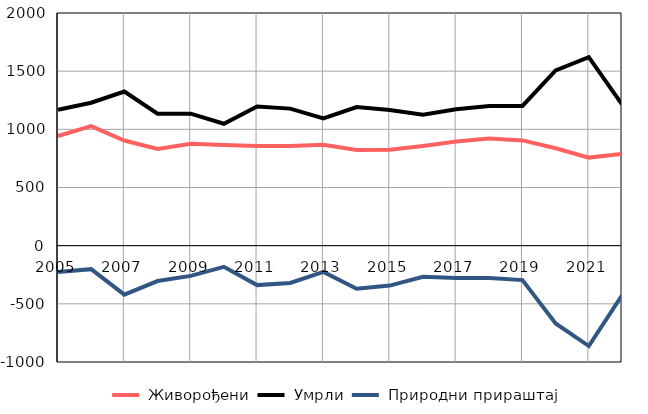
| Category |  Живорођени |  Умрли |  Природни прираштај |
|---|---|---|---|
| 2005.0 | 943 | 1169 | -226 |
| 2006.0 | 1027 | 1229 | -202 |
| 2007.0 | 904 | 1325 | -421 |
| 2008.0 | 831 | 1135 | -304 |
| 2009.0 | 875 | 1135 | -260 |
| 2010.0 | 866 | 1048 | -182 |
| 2011.0 | 857 | 1196 | -339 |
| 2012.0 | 857 | 1178 | -321 |
| 2013.0 | 868 | 1094 | -226 |
| 2014.0 | 822 | 1192 | -370 |
| 2015.0 | 824 | 1167 | -343 |
| 2016.0 | 857 | 1125 | -268 |
| 2017.0 | 895 | 1172 | -277 |
| 2018.0 | 921 | 1200 | -279 |
| 2019.0 | 905 | 1201 | -296 |
| 2020.0 | 837 | 1506 | -669 |
| 2021.0 | 757 | 1620 | -863 |
| 2022.0 | 788 | 1215 | -427 |